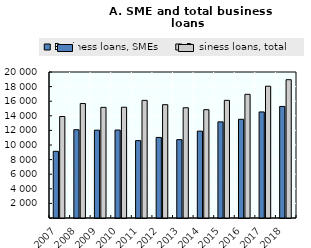
| Category | Business loans, SMEs | Business loans, total  |
|---|---|---|
| 2007.0 | 9136 | 13906 |
| 2008.0 | 12092 | 15679 |
| 2009.0 | 12032 | 15156 |
| 2010.0 | 12046 | 15174 |
| 2011.0 | 10600 | 16117 |
| 2012.0 | 11038 | 15523 |
| 2013.0 | 10734 | 15102.391 |
| 2014.0 | 11902 | 14837.098 |
| 2015.0 | 13170 | 16119 |
| 2016.0 | 13523 | 16943 |
| 2017.0 | 14527 | 18054 |
| 2018.0 | 15281 | 18945 |